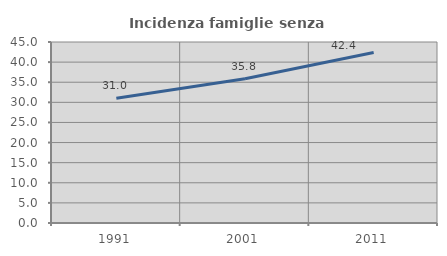
| Category | Incidenza famiglie senza nuclei |
|---|---|
| 1991.0 | 31.016 |
| 2001.0 | 35.849 |
| 2011.0 | 42.377 |